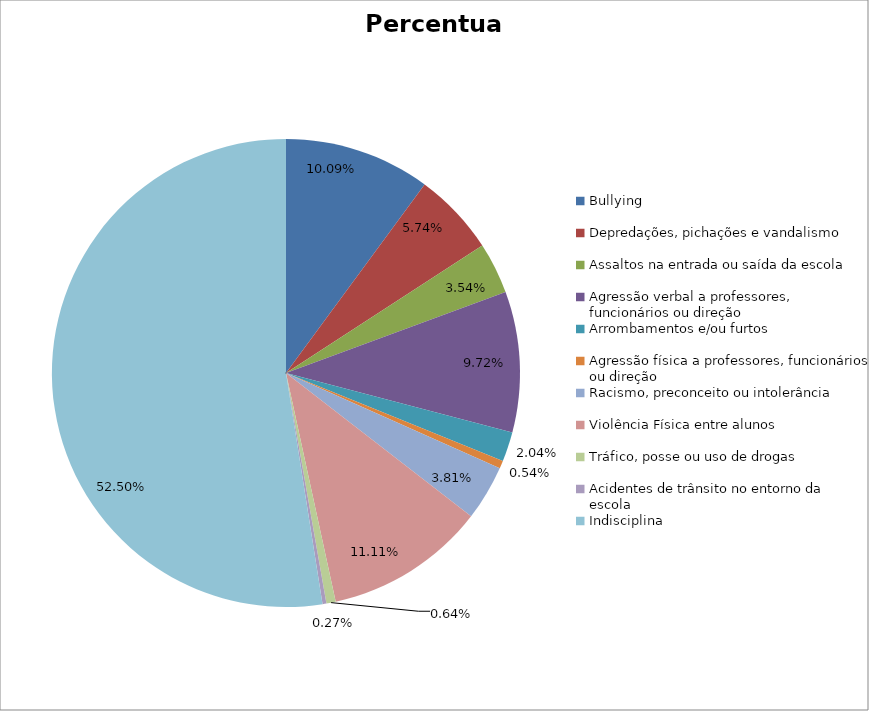
| Category | Percentual |
|---|---|
| Bullying | 0.101 |
| Depredações, pichações e vandalismo | 0.057 |
| Assaltos na entrada ou saída da escola | 0.035 |
| Agressão verbal a professores, funcionários ou direção | 0.097 |
| Arrombamentos e/ou furtos | 0.02 |
| Agressão física a professores, funcionários ou direção | 0.005 |
| Racismo, preconceito ou intolerância | 0.038 |
| Violência Física entre alunos | 0.111 |
| Tráfico, posse ou uso de drogas | 0.006 |
| Acidentes de trânsito no entorno da escola | 0.003 |
| Indisciplina | 0.525 |